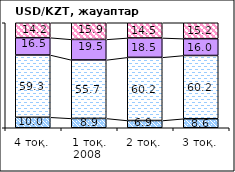
| Category | оң | әсер еткен жоқ | кері | білмеймін |
|---|---|---|---|---|
| 4 тоқ. | 9.98 | 59.3 | 16.5 | 14.22 |
| 1 тоқ. 2008  | 8.87 | 55.72 | 19.54 | 15.87 |
| 2 тоқ. | 6.89 | 60.15 | 18.5 | 14.46 |
| 3 тоқ. | 8.6 | 60.23 | 16 | 15.16 |